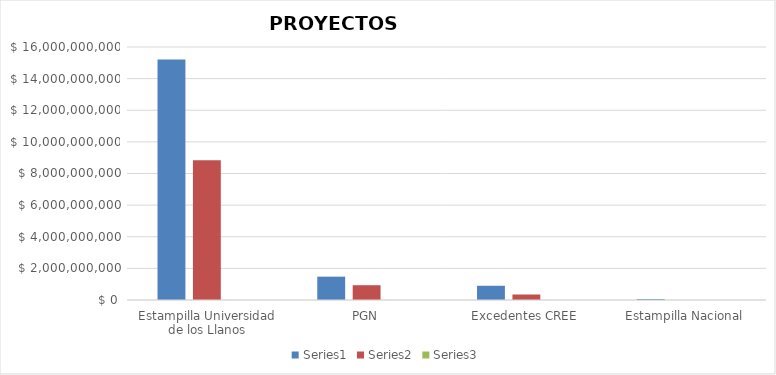
| Category | Series 0 | Series 1 | Series 2 |
|---|---|---|---|
| Estampilla Universidad de los Llanos | 15210171890 | 8834507465 | 0.581 |
| PGN | 1476000000 | 935429464 | 0.634 |
| Excedentes CREE | 899689263 | 347633639 | 0.386 |
| Estampilla Nacional | 61156806 | 0 | 0 |